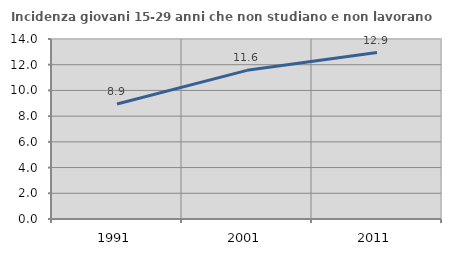
| Category | Incidenza giovani 15-29 anni che non studiano e non lavorano  |
|---|---|
| 1991.0 | 8.939 |
| 2001.0 | 11.562 |
| 2011.0 | 12.95 |